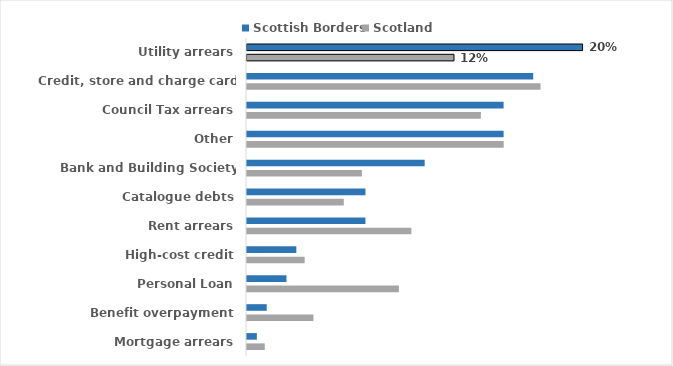
| Category | Scottish Borders | Scotland |
|---|---|---|
| Utility arrears | 0.201 | 0.124 |
| Credit, store and charge card debts | 0.172 | 0.176 |
| Council Tax arrears | 0.154 | 0.14 |
| Other | 0.154 | 0.154 |
| Bank and Building Society overdrafts | 0.107 | 0.069 |
| Catalogue debts | 0.071 | 0.058 |
| Rent arrears | 0.071 | 0.099 |
| High-cost credit | 0.03 | 0.035 |
| Personal Loan | 0.024 | 0.091 |
| Benefit overpayment | 0.012 | 0.04 |
| Mortgage arrears | 0.006 | 0.011 |